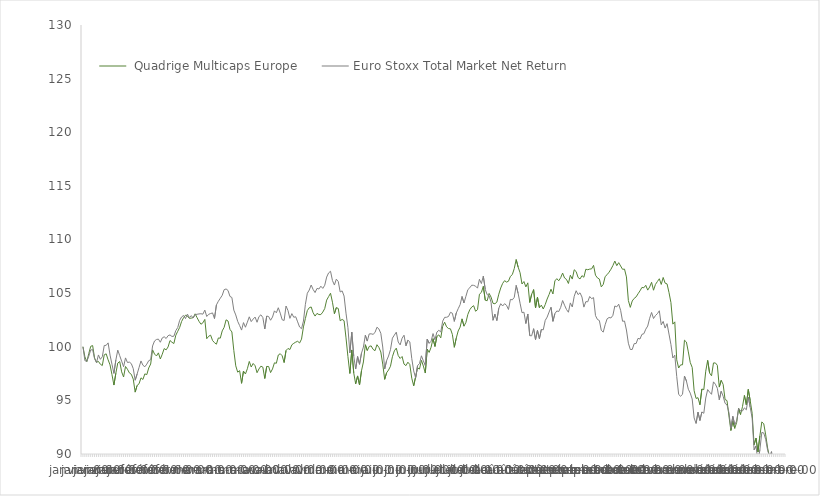
| Category |   Quadrige Multicaps Europe  |  Euro Stoxx Total Market Net Return  |
|---|---|---|
| 0 | 100 | 100 |
| 1900-01-01 | 99.06 | 98.703 |
| 1900-01-02 | 98.61 | 98.641 |
| 1900-01-03 | 99.36 | 99.115 |
| 1900-01-04 | 100.04 | 99.701 |
| 1900-01-05 | 100.11 | 99.733 |
| 1900-01-06 | 98.95 | 98.884 |
| 1900-01-07 | 98.56 | 98.515 |
| 1900-01-08 | 98.63 | 99.237 |
| 1900-01-09 | 98.37 | 98.828 |
| 1900-01-10 | 98.25 | 99.066 |
| 1900-01-11 | 99.25 | 100.118 |
| 1900-01-12 | 99.34 | 100.132 |
| 1900-01-13 | 98.78 | 100.36 |
| 1900-01-14 | 98.31 | 99.224 |
| 1900-01-15 | 97.4 | 98.368 |
| 1900-01-16 | 96.43 | 97.516 |
| 1900-01-17 | 97.53 | 98.762 |
| 1900-01-18 | 98.48 | 99.688 |
| 1900-01-19 | 98.62 | 99.167 |
| 1900-01-20 | 97.66 | 98.655 |
| 1900-01-21 | 97.18 | 98.136 |
| 1900-01-22 | 98.16 | 98.96 |
| 1900-01-23 | 97.9 | 98.532 |
| 1900-01-24 | 97.56 | 98.568 |
| 1900-01-25 | 97.43 | 98.426 |
| 1900-01-26 | 96.98 | 97.956 |
| 1900-01-27 | 95.77 | 96.879 |
| 1900-01-28 | 96.39 | 97.457 |
| 1900-01-29 | 96.55 | 98.07 |
| 1900-01-30 | 97.1 | 98.676 |
| 1900-01-31 | 96.95 | 98.273 |
| 1900-02-01 | 97.47 | 98.135 |
| 1900-02-02 | 97.4 | 98.378 |
| 1900-02-03 | 98.02 | 98.701 |
| 1900-02-04 | 98.39 | 98.793 |
| 1900-02-05 | 99.71 | 100.074 |
| 1900-02-06 | 99.32 | 100.537 |
| 1900-02-07 | 99.14 | 100.678 |
| 1900-02-08 | 99.43 | 100.711 |
| 1900-02-09 | 98.86 | 100.421 |
| 1900-02-10 | 99.3 | 100.822 |
| 1900-02-11 | 99.83 | 100.93 |
| 1900-02-12 | 99.71 | 100.767 |
| 1900-02-13 | 99.98 | 101.032 |
| 1900-02-14 | 100.58 | 101.103 |
| 1900-02-15 | 100.42 | 100.959 |
| 1900-02-16 | 100.3 | 100.984 |
| 1900-02-17 | 101.07 | 101.507 |
| 1900-02-18 | 101.44 | 101.791 |
| 1900-02-19 | 101.8 | 102.463 |
| 1900-02-20 | 102.36 | 102.781 |
| 1900-02-21 | 102.7 | 102.917 |
| 1900-02-22 | 102.94 | 102.624 |
| 1900-02-23 | 102.87 | 103.045 |
| 1900-02-24 | 102.65 | 102.719 |
| 1900-02-25 | 102.67 | 102.903 |
| 1900-02-26 | 102.71 | 102.68 |
| 1900-02-27 | 103.07 | 102.993 |
| 1900-02-28 | 102.71 | 103.029 |
| 1900-02-28 | 102.37 | 103.062 |
| 1900-03-01 | 102.1 | 103.077 |
| 1900-03-02 | 102.23 | 103.04 |
| 1900-03-03 | 102.55 | 103.417 |
| 1900-03-04 | 100.75 | 102.821 |
| 1900-03-05 | 100.98 | 103.023 |
| 1900-03-06 | 101.08 | 103.097 |
| 1900-03-07 | 100.58 | 103.153 |
| 1900-03-08 | 100.38 | 102.63 |
| 1900-03-09 | 100.24 | 103.903 |
| 1900-03-10 | 100.82 | 104.241 |
| 1900-03-11 | 100.8 | 104.52 |
| 1900-03-12 | 101.48 | 104.8 |
| 1900-03-13 | 101.81 | 105.323 |
| 1900-03-14 | 102.51 | 105.388 |
| 1900-03-15 | 102.4 | 105.248 |
| 1900-03-16 | 101.62 | 104.693 |
| 1900-03-17 | 101.38 | 104.593 |
| 1900-03-18 | 99.65 | 103.417 |
| 1900-03-19 | 98.22 | 102.965 |
| 1900-03-20 | 97.63 | 102.366 |
| 1900-03-21 | 97.77 | 101.977 |
| 1900-03-22 | 96.59 | 101.553 |
| 1900-03-23 | 97.73 | 102.25 |
| 1900-03-24 | 97.46 | 101.819 |
| 1900-03-25 | 97.95 | 102.292 |
| 1900-03-26 | 98.63 | 102.79 |
| 1900-03-27 | 98.11 | 102.345 |
| 1900-03-28 | 98.44 | 102.582 |
| 1900-03-29 | 98.23 | 102.767 |
| 1900-03-30 | 97.58 | 102.284 |
| 1900-03-31 | 97.93 | 102.81 |
| 1900-04-01 | 98.19 | 102.976 |
| 1900-04-02 | 98.1 | 102.728 |
| 1900-04-03 | 97.04 | 101.657 |
| 1900-04-04 | 98.16 | 102.863 |
| 1900-04-05 | 98.16 | 102.818 |
| 1900-04-06 | 97.59 | 102.472 |
| 1900-04-07 | 97.93 | 102.767 |
| 1900-04-08 | 98.5 | 103.346 |
| 1900-04-09 | 98.46 | 103.167 |
| 1900-04-10 | 99.23 | 103.637 |
| 1900-04-11 | 99.35 | 103.133 |
| 1900-04-12 | 99.16 | 102.514 |
| 1900-04-13 | 98.53 | 102.452 |
| 1900-04-14 | 99.65 | 103.799 |
| 1900-04-15 | 99.84 | 103.377 |
| 1900-04-16 | 99.74 | 102.646 |
| 1900-04-17 | 100.18 | 103.09 |
| 1900-04-18 | 100.32 | 102.75 |
| 1900-04-19 | 100.43 | 102.798 |
| 1900-04-20 | 100.51 | 102.32 |
| 1900-04-21 | 100.35 | 101.839 |
| 1900-04-22 | 100.71 | 101.684 |
| 1900-04-23 | 101.85 | 102.398 |
| 1900-04-24 | 102.63 | 103.948 |
| 1900-04-25 | 103.37 | 104.989 |
| 1900-04-26 | 103.64 | 105.288 |
| 1900-04-27 | 103.71 | 105.756 |
| 1900-04-28 | 103.17 | 105.34 |
| 1900-04-29 | 102.86 | 105.051 |
| 1900-04-30 | 103.11 | 105.439 |
| 1900-05-01 | 103 | 105.385 |
| 1900-05-02 | 103 | 105.645 |
| 1900-05-03 | 103.23 | 105.442 |
| 1900-05-04 | 103.56 | 105.732 |
| 1900-05-05 | 104.35 | 106.497 |
| 1900-05-06 | 104.67 | 106.884 |
| 1900-05-07 | 104.99 | 107.039 |
| 1900-05-08 | 104.15 | 106.173 |
| 1900-05-09 | 103.08 | 105.754 |
| 1900-05-10 | 103.65 | 106.302 |
| 1900-05-11 | 103.57 | 106.081 |
| 1900-05-12 | 102.42 | 105.105 |
| 1900-05-13 | 102.55 | 105.208 |
| 1900-05-14 | 102.43 | 104.727 |
| 1900-05-15 | 100.83 | 103.133 |
| 1900-05-16 | 99.08 | 101.78 |
| 1900-05-17 | 97.51 | 99.427 |
| 1900-05-18 | 99.7 | 101.361 |
| 1900-05-19 | 97.56 | 99.123 |
| 1900-05-20 | 96.54 | 97.924 |
| 1900-05-21 | 97.28 | 99.089 |
| 1900-05-22 | 96.44 | 98.363 |
| 1900-05-23 | 97.75 | 99.401 |
| 1900-05-24 | 98.58 | 99.971 |
| 1900-05-25 | 100.19 | 101.074 |
| 1900-05-26 | 99.65 | 100.528 |
| 1900-05-27 | 100.03 | 101.196 |
| 1900-05-28 | 100.08 | 101.207 |
| 1900-05-29 | 99.76 | 101.156 |
| 1900-05-30 | 99.63 | 101.33 |
| 1900-05-31 | 100.19 | 101.82 |
| 1900-06-01 | 99.94 | 101.664 |
| 1900-06-02 | 99.51 | 101.252 |
| 1900-06-03 | 98.38 | 99.975 |
| 1900-06-04 | 96.96 | 97.922 |
| 1900-06-05 | 97.58 | 98.714 |
| 1900-06-06 | 97.83 | 99.136 |
| 1900-06-07 | 98.18 | 99.728 |
| 1900-06-08 | 99.07 | 100.802 |
| 1900-06-09 | 99.62 | 101.086 |
| 1900-06-10 | 99.87 | 101.359 |
| 1900-06-11 | 99.18 | 100.438 |
| 1900-06-12 | 98.91 | 100.172 |
| 1900-06-13 | 99.09 | 100.793 |
| 1900-06-14 | 98.38 | 101.075 |
| 1900-06-15 | 98.24 | 100.087 |
| 1900-06-16 | 98.56 | 100.613 |
| 1900-06-17 | 98.34 | 100.452 |
| 1900-06-18 | 97.07 | 98.908 |
| 1900-06-19 | 96.36 | 97.748 |
| 1900-06-20 | 97.2 | 97.1 |
| 1900-06-21 | 98.03 | 98.236 |
| 1900-06-22 | 97.92 | 98.434 |
| 1900-06-23 | 98.73 | 99.157 |
| 1900-06-24 | 98.2 | 98.679 |
| 1900-06-25 | 97.55 | 98.256 |
| 1900-06-26 | 99.79 | 100.714 |
| 1900-06-27 | 99.47 | 100.321 |
| 1900-06-28 | 99.96 | 100.512 |
| 1900-06-29 | 100.76 | 101.229 |
| 1900-06-30 | 100.03 | 100.649 |
| 1900-07-01 | 100.97 | 101.372 |
| 1900-07-02 | 101.11 | 101.533 |
| 1900-07-03 | 100.83 | 101.378 |
| 1900-07-04 | 101.92 | 102.393 |
| 1900-07-05 | 102.29 | 102.739 |
| 1900-07-06 | 101.86 | 102.748 |
| 1900-07-07 | 101.7 | 102.821 |
| 1900-07-08 | 101.67 | 103.211 |
| 1900-07-09 | 101.15 | 103.127 |
| 1900-07-10 | 99.95 | 102.365 |
| 1900-07-11 | 100.8 | 103.141 |
| 1900-07-12 | 101.47 | 103.549 |
| 1900-07-13 | 101.83 | 103.921 |
| 1900-07-14 | 102.6 | 104.689 |
| 1900-07-15 | 101.92 | 104.078 |
| 1900-07-16 | 102.27 | 104.705 |
| 1900-07-17 | 103.02 | 105.324 |
| 1900-07-18 | 103.45 | 105.498 |
| 1900-07-19 | 103.7 | 105.74 |
| 1900-07-20 | 103.83 | 105.725 |
| 1900-07-21 | 103.31 | 105.648 |
| 1900-07-22 | 103.46 | 105.464 |
| 1900-07-23 | 104.9 | 106.291 |
| 1900-07-24 | 105.07 | 105.891 |
| 1900-07-25 | 105.63 | 106.583 |
| 1900-07-26 | 104.34 | 105.347 |
| 1900-07-27 | 104.29 | 104.849 |
| 1900-07-28 | 104.97 | 104.762 |
| 1900-07-29 | 104.63 | 104.142 |
| 1900-07-30 | 104.05 | 102.469 |
| 1900-07-31 | 104.01 | 103.048 |
| 1900-08-01 | 104.16 | 102.436 |
| 1900-08-02 | 104.9 | 103.588 |
| 1900-08-03 | 105.48 | 104.014 |
| 1900-08-04 | 105.91 | 103.802 |
| 1900-08-05 | 106.16 | 104.016 |
| 1900-08-06 | 106.03 | 103.862 |
| 1900-08-07 | 106.11 | 103.474 |
| 1900-08-08 | 106.56 | 104.412 |
| 1900-08-09 | 106.73 | 104.378 |
| 1900-08-10 | 107.29 | 104.606 |
| 1900-08-11 | 108.13 | 105.72 |
| 1900-08-12 | 107.43 | 104.973 |
| 1900-08-13 | 106.9 | 104.058 |
| 1900-08-14 | 105.85 | 103.172 |
| 1900-08-15 | 106.08 | 103.223 |
| 1900-08-16 | 105.58 | 102.165 |
| 1900-08-17 | 105.96 | 103.054 |
| 1900-08-18 | 104.13 | 101.033 |
| 1900-08-19 | 104.9 | 101.021 |
| 1900-08-20 | 105.33 | 101.684 |
| 1900-08-21 | 103.62 | 100.672 |
| 1900-08-22 | 104.62 | 101.529 |
| 1900-08-23 | 103.64 | 100.754 |
| 1900-08-24 | 103.88 | 101.614 |
| 1900-08-25 | 103.52 | 101.577 |
| 1900-08-26 | 103.93 | 102.453 |
| 1900-08-27 | 104.45 | 102.764 |
| 1900-08-28 | 104.87 | 103.232 |
| 1900-08-29 | 105.37 | 103.682 |
| 1900-08-30 | 104.92 | 102.37 |
| 1900-08-31 | 106.14 | 103.088 |
| 1900-09-01 | 106.35 | 103.338 |
| 1900-09-02 | 106.15 | 103.284 |
| 1900-09-03 | 106.44 | 103.672 |
| 1900-09-04 | 106.87 | 104.309 |
| 1900-09-05 | 106.41 | 103.873 |
| 1900-09-06 | 106.28 | 103.478 |
| 1900-09-07 | 105.9 | 103.217 |
| 1900-09-08 | 106.67 | 104.089 |
| 1900-09-09 | 106.31 | 103.71 |
| 1900-09-10 | 107.18 | 104.71 |
| 1900-09-11 | 107.01 | 105.223 |
| 1900-09-12 | 106.46 | 104.86 |
| 1900-09-13 | 106.32 | 105.029 |
| 1900-09-14 | 106.63 | 104.635 |
| 1900-09-15 | 106.48 | 103.695 |
| 1900-09-16 | 107.23 | 104.204 |
| 1900-09-17 | 107.18 | 104.193 |
| 1900-09-18 | 107.24 | 104.685 |
| 1900-09-19 | 107.26 | 104.483 |
| 1900-09-20 | 107.59 | 104.581 |
| 1900-09-21 | 106.67 | 102.905 |
| 1900-09-22 | 106.42 | 102.546 |
| 1900-09-23 | 106.31 | 102.444 |
| 1900-09-24 | 105.58 | 101.533 |
| 1900-09-25 | 105.81 | 101.364 |
| 1900-09-26 | 106.55 | 102.056 |
| 1900-09-27 | 106.72 | 102.602 |
| 1900-09-28 | 106.95 | 102.728 |
| 1900-09-29 | 107.23 | 102.685 |
| 1900-09-30 | 107.57 | 102.928 |
| 1900-10-01 | 107.99 | 103.8 |
| 1900-10-02 | 107.56 | 103.723 |
| 1900-10-03 | 107.84 | 103.968 |
| 1900-10-04 | 107.53 | 103.394 |
| 1900-10-05 | 107.22 | 102.374 |
| 1900-10-06 | 107.24 | 102.396 |
| 1900-10-07 | 106.51 | 101.561 |
| 1900-10-08 | 104.31 | 100.329 |
| 1900-10-09 | 103.67 | 99.742 |
| 1900-10-10 | 104.27 | 99.749 |
| 1900-10-11 | 104.51 | 100.29 |
| 1900-10-12 | 104.65 | 100.303 |
| 1900-10-13 | 104.94 | 100.784 |
| 1900-10-14 | 105.21 | 100.722 |
| 1900-10-15 | 105.53 | 101.155 |
| 1900-10-16 | 105.5 | 101.215 |
| 1900-10-17 | 105.73 | 101.639 |
| 1900-10-18 | 105.28 | 101.929 |
| 1900-10-19 | 105.57 | 102.654 |
| 1900-10-20 | 106.01 | 103.197 |
| 1900-10-21 | 105.27 | 102.632 |
| 1900-10-22 | 105.81 | 102.908 |
| 1900-10-23 | 106.08 | 103.082 |
| 1900-10-24 | 106.34 | 103.357 |
| 1900-10-25 | 105.81 | 102.041 |
| 1900-10-26 | 106.46 | 102.362 |
| 1900-10-27 | 105.93 | 101.743 |
| 1900-10-28 | 105.86 | 102.152 |
| 1900-10-29 | 105.06 | 101.184 |
| 1900-10-30 | 104.12 | 100.214 |
| 1900-10-31 | 102.11 | 98.951 |
| 1900-11-01 | 102.32 | 99.215 |
| 1900-11-02 | 98.78 | 97.233 |
| 1900-11-03 | 98.02 | 95.553 |
| 1900-11-04 | 98.31 | 95.39 |
| 1900-11-05 | 98.32 | 95.563 |
| 1900-11-06 | 100.61 | 97.263 |
| 1900-11-07 | 100.44 | 96.813 |
| 1900-11-08 | 99.52 | 96.038 |
| 1900-11-09 | 98.53 | 95.675 |
| 1900-11-10 | 98.07 | 95.126 |
| 1900-11-11 | 95.9 | 93.363 |
| 1900-11-12 | 95.18 | 92.852 |
| 1900-11-13 | 95.25 | 93.901 |
| 1900-11-14 | 94.59 | 93.127 |
| 1900-11-15 | 96.06 | 93.92 |
| 1900-11-16 | 96 | 93.796 |
| 1900-11-17 | 97.72 | 95.217 |
| 1900-11-18 | 98.73 | 96.007 |
| 1900-11-19 | 97.55 | 95.767 |
| 1900-11-20 | 97.29 | 95.567 |
| 1900-11-21 | 98.49 | 96.726 |
| 1900-11-22 | 98.49 | 96.504 |
| 1900-11-23 | 98.27 | 96.127 |
| 1900-11-24 | 96.24 | 95.061 |
| 1900-11-25 | 96.87 | 95.852 |
| 1900-11-26 | 96.49 | 95.385 |
| 1900-11-27 | 95.08 | 94.725 |
| 1900-11-28 | 94.98 | 94.584 |
| 1900-11-29 | 93.55 | 93.856 |
| 1900-11-30 | 92.19 | 92.399 |
| 1900-12-01 | 93.08 | 93.51 |
| 1900-12-02 | 92.39 | 92.736 |
| 1900-12-03 | 92.95 | 93.087 |
| 1900-12-04 | 94.25 | 94.246 |
| 1900-12-05 | 93.68 | 94.024 |
| 1900-12-06 | 94.41 | 94.012 |
| 1900-12-07 | 95.46 | 94.299 |
| 1900-12-08 | 94.58 | 94.12 |
| 1900-12-09 | 96.02 | 95.317 |
| 1900-12-10 | 94.97 | 94.345 |
| 1900-12-11 | 93.8 | 93.348 |
| 1900-12-12 | 90.86 | 90.387 |
| 1900-12-13 | 91.48 | 90.75 |
| 1900-12-14 | 90.19 | 89.266 |
| 1900-12-15 | 91.69 | 90.407 |
| 1900-12-16 | 92.99 | 92.015 |
| 1900-12-17 | 92.82 | 91.96 |
| 1900-12-18 | 91.78 | 91.352 |
| 1900-12-19 | 90.55 | 90.34 |
| 1900-12-20 | 89.72 | 89.78 |
| 1900-12-21 | 89.89 | 90.22 |
| 1900-12-22 | 87.91 | 88.59 |
| 1900-12-23 | 87.89 | 88.46 |
| 1900-12-24 | 87.35 | 87.88 |
| 1900-12-25 | 86.83 | 86.72 |
| 1900-12-26 | 88.5 | 88.16 |
| 1900-12-27 | 89.08 | 88.65 |
| 1900-12-28 | 88.97 | 88.47 |